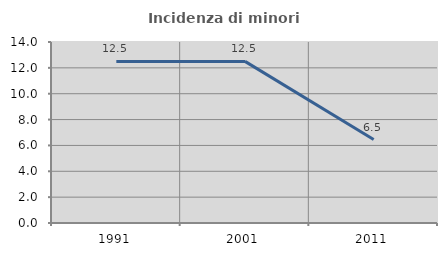
| Category | Incidenza di minori stranieri |
|---|---|
| 1991.0 | 12.5 |
| 2001.0 | 12.5 |
| 2011.0 | 6.452 |